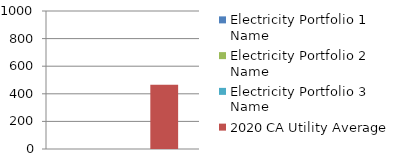
| Category | Electricity Portfolio 1 Name | Electricity Portfolio 2 Name | Electricity Portfolio 3 Name | 2020 CA Utility Average |
|---|---|---|---|---|
| 0 | 0 | 0 | 0 | 466 |